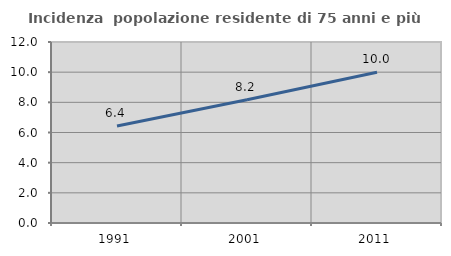
| Category | Incidenza  popolazione residente di 75 anni e più |
|---|---|
| 1991.0 | 6.434 |
| 2001.0 | 8.168 |
| 2011.0 | 10 |